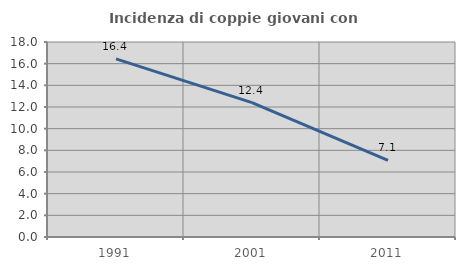
| Category | Incidenza di coppie giovani con figli |
|---|---|
| 1991.0 | 16.446 |
| 2001.0 | 12.4 |
| 2011.0 | 7.079 |